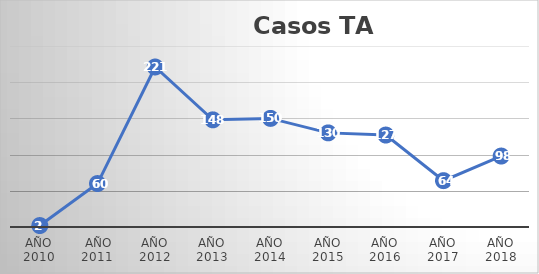
| Category | Series 0 |
|---|---|
| AÑO 2010 | 2 |
|  AÑO 2011 | 60 |
| AÑO 2012 | 221 |
| AÑO 2013 | 148 |
| AÑO 2014 | 150 |
| AÑO 2015 | 130 |
| AÑO 2016 | 127 |
| AÑO 2017 | 64 |
| AÑO 2018 | 98 |